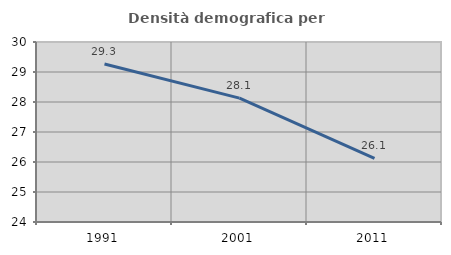
| Category | Densità demografica |
|---|---|
| 1991.0 | 29.265 |
| 2001.0 | 28.131 |
| 2011.0 | 26.118 |